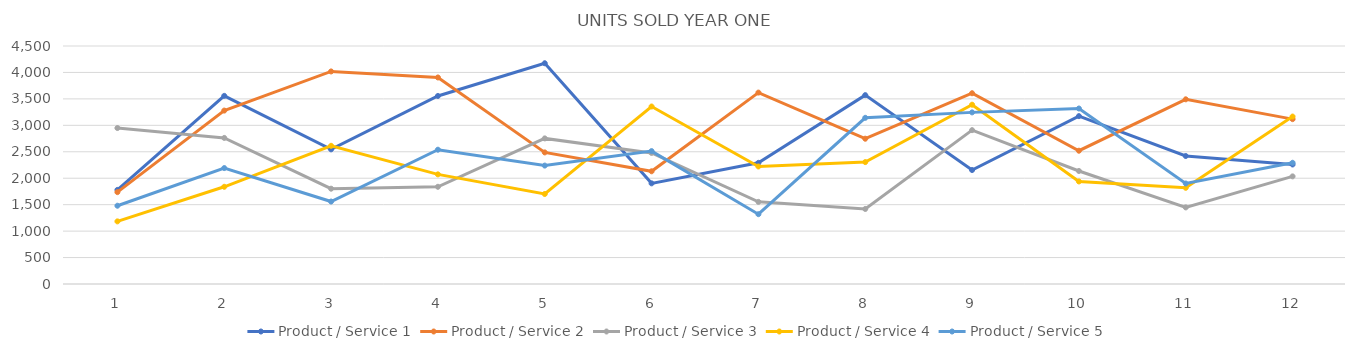
| Category | Product / Service 1 | Product / Service 2 | Product / Service 3 | Product / Service 4 | Product / Service 5 |
|---|---|---|---|---|---|
| 0 | 1779 | 1737 | 2949 | 1184 | 1480 |
| 1 | 3557 | 3279 | 2762 | 1838 | 2192 |
| 2 | 2546 | 4019 | 1802 | 2613 | 1559 |
| 3 | 3555 | 3905 | 1838 | 2073 | 2539 |
| 4 | 4174 | 2488 | 2753 | 1702 | 2239 |
| 5 | 1903 | 2131 | 2478 | 3356 | 2513 |
| 6 | 2291 | 3619 | 1553 | 2222 | 1320 |
| 7 | 3571 | 2747 | 1419 | 2305 | 3142 |
| 8 | 2155 | 3607 | 2909 | 3390 | 3245 |
| 9 | 3174 | 2520 | 2137 | 1939 | 3318 |
| 10 | 2420 | 3492 | 1448 | 1819 | 1900 |
| 11 | 2260 | 3117 | 2035 | 3166 | 2292 |